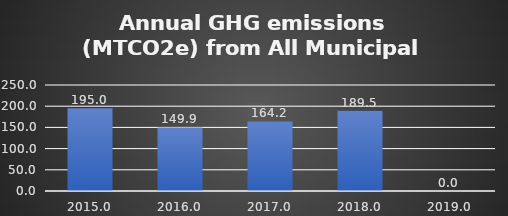
| Category | Series 0 |
|---|---|
| 2015.0 | 194.982 |
| 2016.0 | 149.901 |
| 2017.0 | 164.161 |
| 2018.0 | 189.487 |
| 2019.0 | 0 |